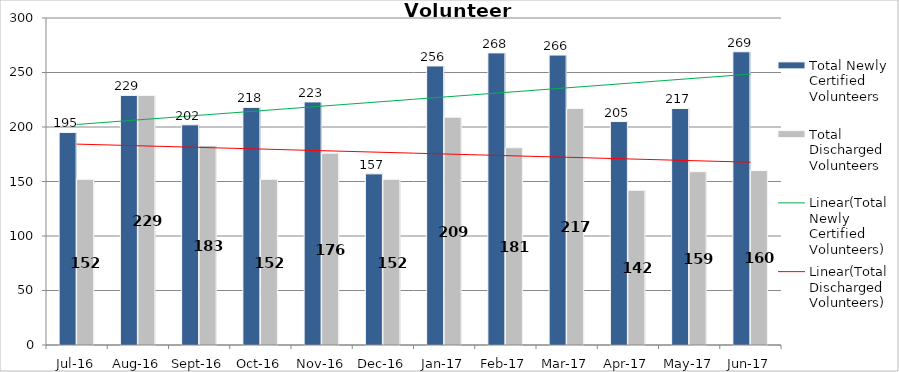
| Category | Total Newly Certified Volunteers | Total Discharged Volunteers |
|---|---|---|
| Jul-16 | 195 | 152 |
| Aug-16 | 229 | 229 |
| Sep-16 | 202 | 183 |
| Oct-16 | 218 | 152 |
| Nov-16 | 223 | 176 |
| Dec-16 | 157 | 152 |
| Jan-17 | 256 | 209 |
| Feb-17 | 268 | 181 |
| Mar-17 | 266 | 217 |
| Apr-17 | 205 | 142 |
| May-17 | 217 | 159 |
| Jun-17 | 269 | 160 |